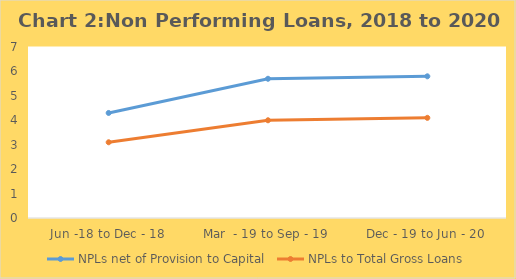
| Category | NPLs net of Provision to Capital | NPLs to Total Gross Loans |
|---|---|---|
| Jun -18 to Dec - 18 | 4.3 | 3.1 |
| Mar  - 19 to Sep - 19 | 5.7 | 4 |
| Dec - 19 to Jun - 20 | 5.8 | 4.1 |